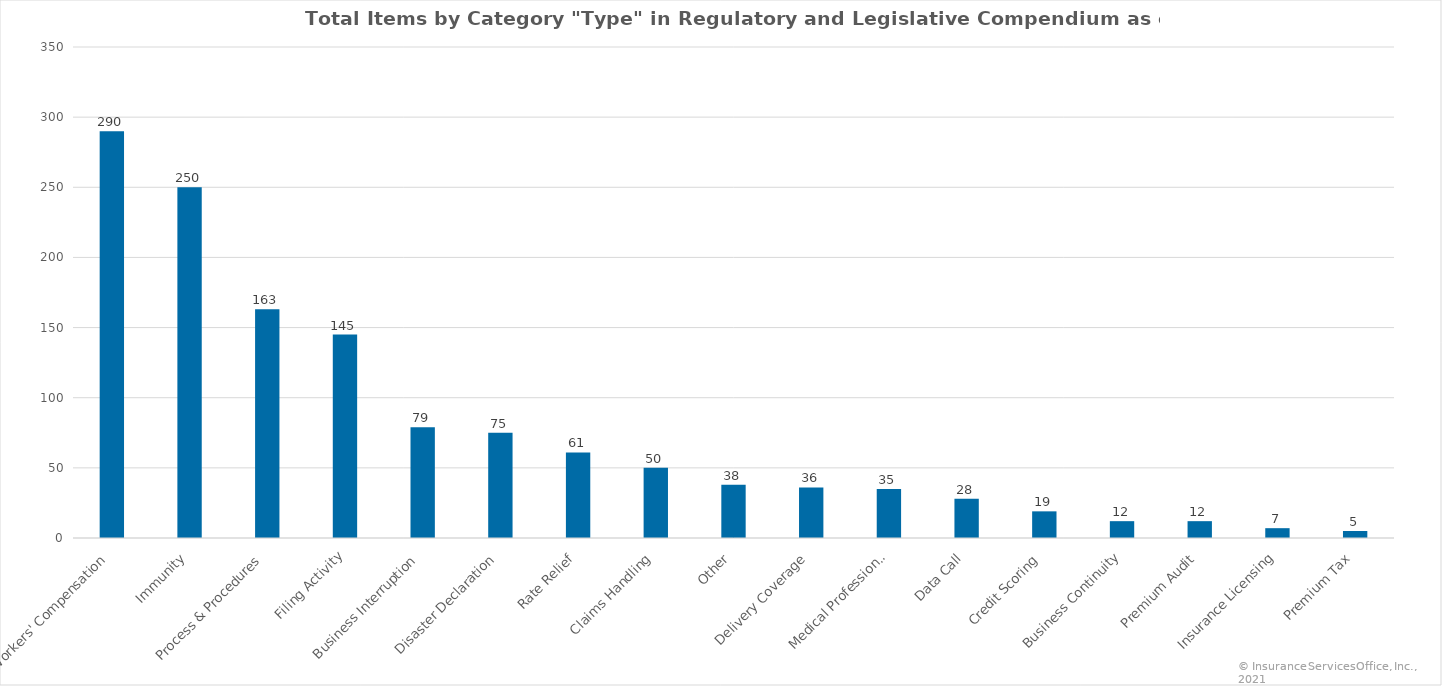
| Category | Count |
|---|---|
| Workers' Compensation | 290 |
| Immunity | 250 |
| Process & Procedures | 163 |
| Filing Activity | 145 |
| Business Interruption | 79 |
| Disaster Declaration | 75 |
| Rate Relief | 61 |
| Claims Handling | 50 |
| Other | 38 |
| Delivery Coverage | 36 |
| Medical Professional | 35 |
| Data Call | 28 |
| Credit Scoring | 19 |
| Business Continuity | 12 |
| Premium Audit | 12 |
| Insurance Licensing | 7 |
| Premium Tax | 5 |